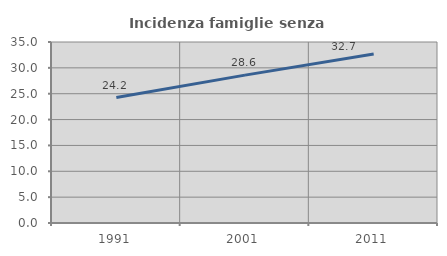
| Category | Incidenza famiglie senza nuclei |
|---|---|
| 1991.0 | 24.249 |
| 2001.0 | 28.596 |
| 2011.0 | 32.698 |